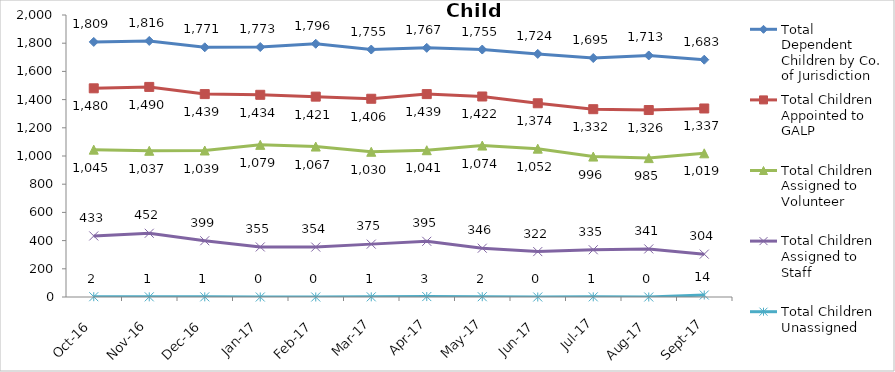
| Category | Total Dependent Children by Co. of Jurisdiction | Total Children Appointed to GALP | Total Children Assigned to Volunteer | Total Children Assigned to Staff | Total Children Unassigned |
|---|---|---|---|---|---|
| 2016-10-01 | 1809 | 1480 | 1045 | 433 | 2 |
| 2016-11-01 | 1816 | 1490 | 1037 | 452 | 1 |
| 2016-12-01 | 1771 | 1439 | 1039 | 399 | 1 |
| 2017-01-01 | 1773 | 1434 | 1079 | 355 | 0 |
| 2017-02-01 | 1796 | 1421 | 1067 | 354 | 0 |
| 2017-03-01 | 1755 | 1406 | 1030 | 375 | 1 |
| 2017-04-01 | 1767 | 1439 | 1041 | 395 | 3 |
| 2017-05-01 | 1755 | 1422 | 1074 | 346 | 2 |
| 2017-06-01 | 1724 | 1374 | 1052 | 322 | 0 |
| 2017-07-01 | 1695 | 1332 | 996 | 335 | 1 |
| 2017-08-01 | 1713 | 1326 | 985 | 341 | 0 |
| 2017-09-01 | 1683 | 1337 | 1019 | 304 | 14 |